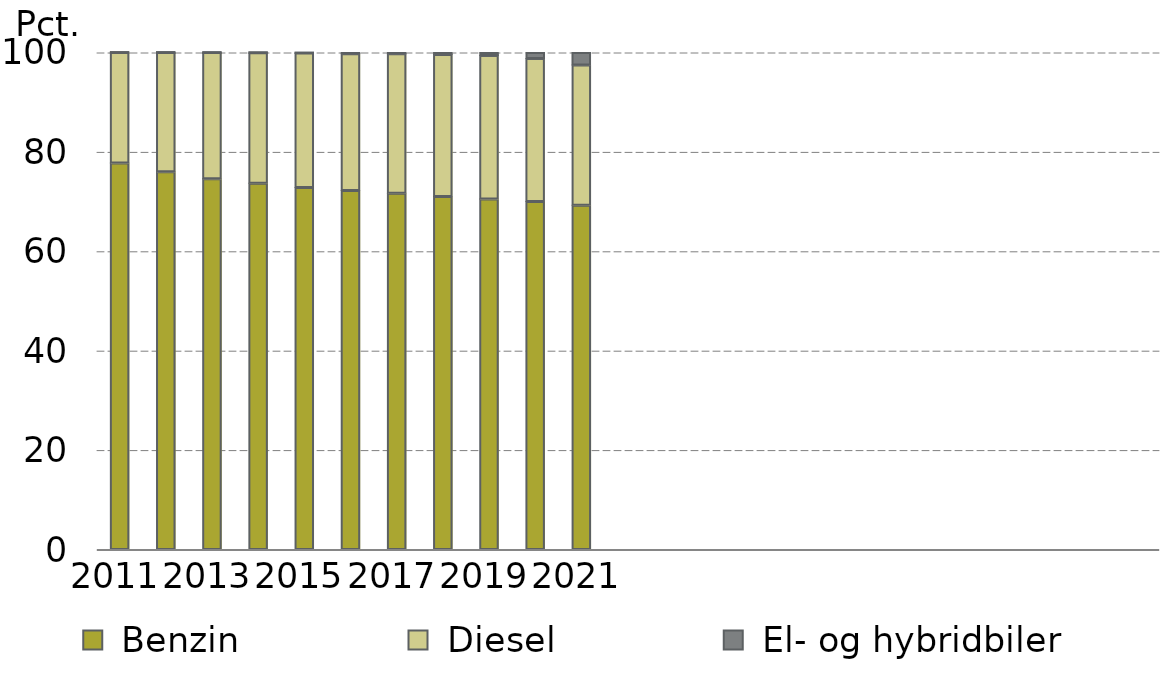
| Category |  Benzin |  Diesel |  El- og hybridbiler |
|---|---|---|---|
| 0 | 77.761 | 22.231 | 0.007 |
| 1 | 76.025 | 23.964 | 0.01 |
| 2 | 74.578 | 25.403 | 0.018 |
| 3 | 73.677 | 26.281 | 0.041 |
| 4 | 72.849 | 27.04 | 0.11 |
| 5 | 72.228 | 27.536 | 0.235 |
| 6 | 71.697 | 28.034 | 0.268 |
| 7 | 71.005 | 28.614 | 0.38 |
| 8 | 70.539 | 28.834 | 0.626 |
| 9 | 70.045 | 28.73 | 1.224 |
| 10 | 69.257 | 28.213 | 2.529 |